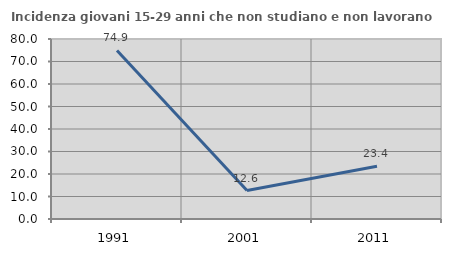
| Category | Incidenza giovani 15-29 anni che non studiano e non lavorano  |
|---|---|
| 1991.0 | 74.918 |
| 2001.0 | 12.632 |
| 2011.0 | 23.438 |